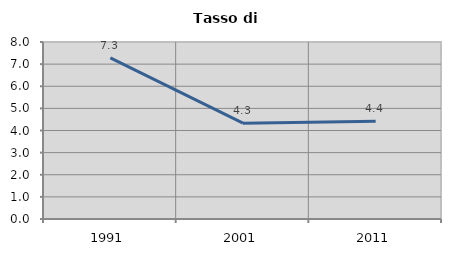
| Category | Tasso di disoccupazione   |
|---|---|
| 1991.0 | 7.282 |
| 2001.0 | 4.331 |
| 2011.0 | 4.416 |